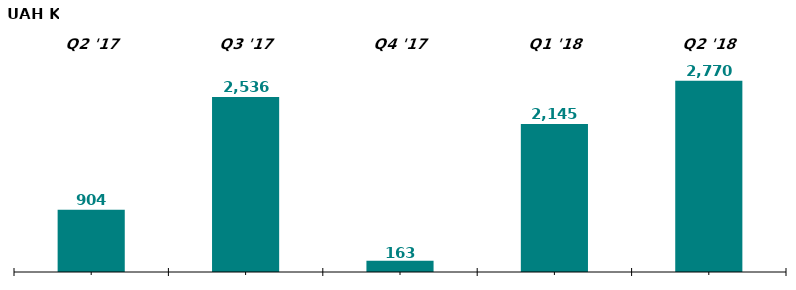
| Category | Series 1 |
|---|---|
| Q2 '17 | 903.571 |
| Q3 '17 | 2536.489 |
| Q4 '17 | 162.522 |
| Q1 '18 | 2145.214 |
| Q2 '18 | 2770.106 |